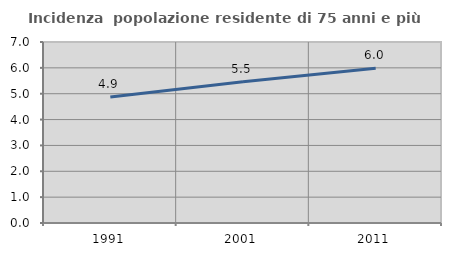
| Category | Incidenza  popolazione residente di 75 anni e più |
|---|---|
| 1991.0 | 4.872 |
| 2001.0 | 5.467 |
| 2011.0 | 5.98 |